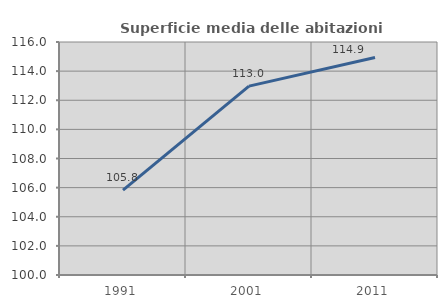
| Category | Superficie media delle abitazioni occupate |
|---|---|
| 1991.0 | 105.832 |
| 2001.0 | 112.97 |
| 2011.0 | 114.94 |